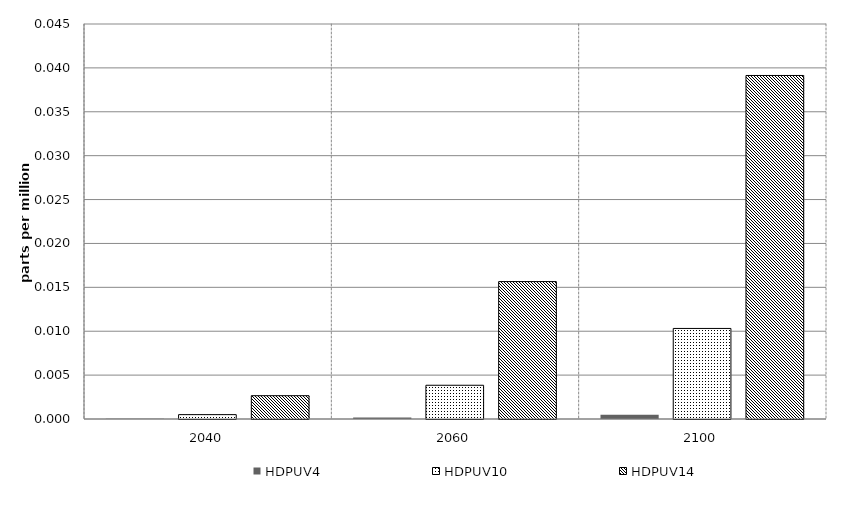
| Category | HDPUV4 | HDPUV10 | HDPUV14 | Alt 5 | Alt 6 | Alt 7 | Alt 8 | Alt 10 |
|---|---|---|---|---|---|---|---|---|
| 2040.0 | 0 | 0 | 0.003 |  |  |  |  |  |
| 2060.0 | 0 | 0.004 | 0.016 |  |  |  |  |  |
| 2100.0 | 0 | 0.01 | 0.039 |  |  |  |  |  |